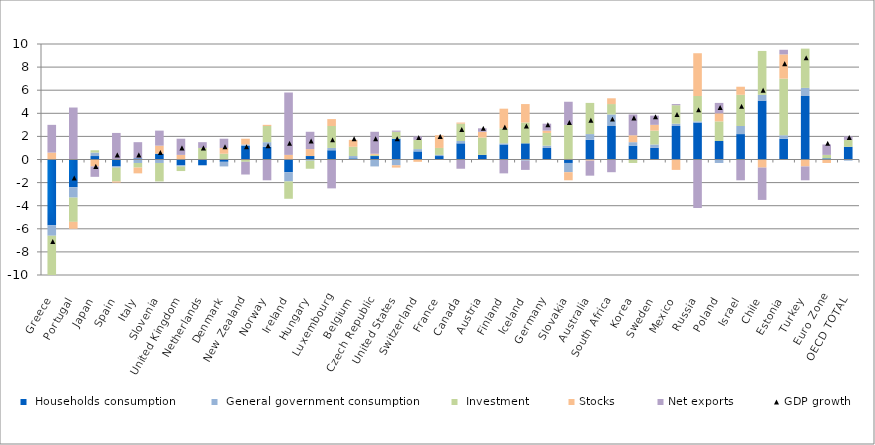
| Category |  Households consumption |  General government consumption |  Investment | Stocks | Net exports |
|---|---|---|---|---|---|
| Greece | -5.7 | -0.9 | -3.5 | 0.6 | 2.4 |
| Portugal | -2.4 | -0.9 | -2.1 | -0.6 | 4.5 |
| Japan | 0.3 | 0.3 | 0.2 | -0.6 | -0.9 |
| Spain | -0.6 | -0.1 | -1.2 | -0.1 | 2.3 |
| Italy | 0.1 | -0.3 | -0.4 | -0.5 | 1.4 |
| Slovenia | 0.5 | -0.3 | -1.6 | 0.7 | 1.3 |
| United Kingdom | -0.5 | -0.1 | -0.4 | 0.4 | 1.4 |
| Netherlands | -0.5 | 0 | 1 | 0 | 0.5 |
| Denmark | -0.2 | -0.4 | 0.5 | 0.5 | 0.8 |
| New Zealand | 1.2 | 0.1 | -0.2 | 0.5 | -1.1 |
| Norway | 1.1 | 0.4 | 1.4 | 0.1 | -1.8 |
| Ireland | -1.1 | -0.8 | -1.5 | 0.4 | 5.4 |
| Hungary | 0.3 | -0.1 | -0.7 | 0.6 | 1.5 |
| Luxembourg | 0.8 | 0.2 | 1.9 | 0.6 | -2.5 |
| Belgium | 0.1 | 0.2 | 0.8 | 0.6 | 0 |
| Czech Republic | 0.3 | -0.6 | 0.1 | 0.1 | 1.9 |
| United States | 1.8 | -0.5 | 0.6 | -0.2 | 0.1 |
| Switzerland | 0.7 | 0.2 | 0.8 | -0.2 | 0.3 |
| France | 0.3 | 0.1 | 0.6 | 1.1 | 0 |
| Canada | 1.4 | 0.2 | 1.5 | 0.1 | -0.8 |
| Austria | 0.4 | 0 | 1.5 | 0.5 | 0.3 |
| Finland | 1.3 | 0.1 | 1.3 | 1.7 | -1.2 |
| Iceland | 1.4 | -0.1 | 1.8 | 1.6 | -0.8 |
| Germany | 1 | 0.2 | 1.1 | 0.2 | 0.6 |
| Slovakia | -0.3 | -0.8 | 3 | -0.7 | 2 |
| Australia | 1.7 | 0.5 | 2.7 | -0.1 | -1.3 |
| South Africa | 2.9 | 1 | 0.9 | 0.5 | -1.1 |
| Korea | 1.2 | 0.3 | -0.3 | 0.6 | 1.8 |
| Sweden | 1 | 0.3 | 1.2 | 0.5 | 0.8 |
| Mexico | 2.9 | 0.2 | 1.6 | -0.9 | 0.1 |
| Russia | 3.2 | 0.1 | 2.2 | 3.7 | -4.2 |
| Poland | 1.6 | -0.3 | 1.7 | 0.7 | 0.9 |
| Israel | 2.2 | 0.7 | 2.7 | 0.7 | -1.8 |
| Chile | 5.1 | 0.5 | 3.8 | -0.7 | -2.8 |
| Estonia | 1.8 | 0.3 | 4.9 | 2.1 | 0.4 |
| Turkey | 5.5 | 0.7 | 3.4 | -0.6 | -1.2 |
| Euro Zone | 0.1 | 0 | 0.3 | -0.3 | 0.9 |
| OECD TOTAL | 1.1 | -0.1 | 0.6 | 0 | 0.3 |